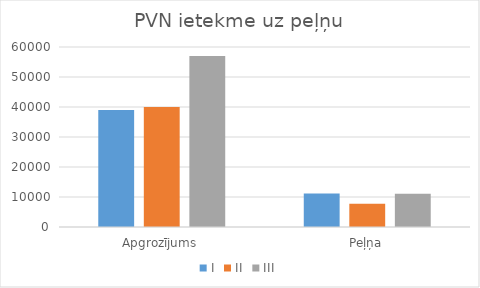
| Category | I | II | III |
|---|---|---|---|
| Apgrozījums | 39000 | 40000 | 57000 |
| Peļņa | 11200 | 7749.099 | 11042.467 |